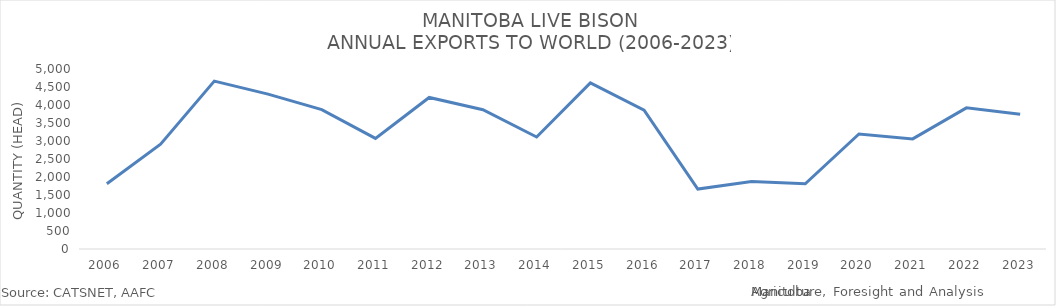
| Category | Series 0 |
|---|---|
| 2006 | 1813 |
| 2007 | 2911 |
| 2008 | 4664 |
| 2009 | 4303 |
| 2010 | 3872 |
| 2011 | 3072 |
| 2012 | 4210 |
| 2013 | 3870 |
| 2014 | 3112 |
| 2015 | 4613 |
| 2016 | 3857 |
| 2017 | 1665 |
| 2018 | 1878 |
| 2019 | 1813 |
| 2020 | 3194 |
| 2021 | 3059 |
| 2022 | 3921 |
| 2023 | 3741 |